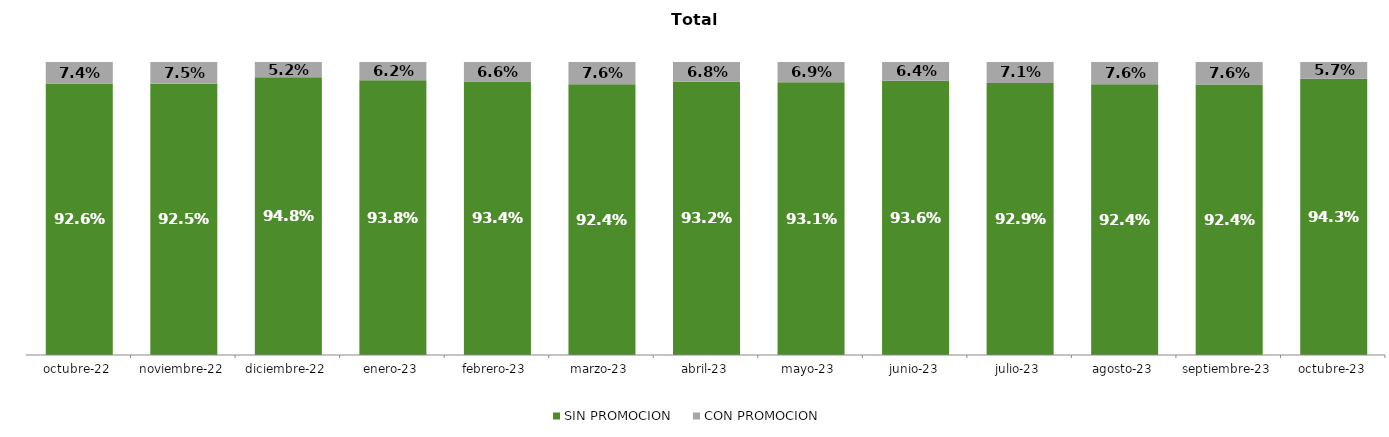
| Category | SIN PROMOCION   | CON PROMOCION   |
|---|---|---|
| 2022-10-01 | 0.926 | 0.074 |
| 2022-11-01 | 0.925 | 0.075 |
| 2022-12-01 | 0.948 | 0.052 |
| 2023-01-01 | 0.938 | 0.062 |
| 2023-02-01 | 0.934 | 0.066 |
| 2023-03-01 | 0.924 | 0.076 |
| 2023-04-01 | 0.932 | 0.068 |
| 2023-05-01 | 0.931 | 0.069 |
| 2023-06-01 | 0.936 | 0.064 |
| 2023-07-01 | 0.929 | 0.071 |
| 2023-08-01 | 0.924 | 0.076 |
| 2023-09-01 | 0.924 | 0.076 |
| 2023-10-01 | 0.943 | 0.057 |